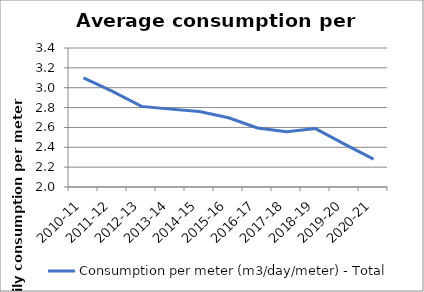
| Category | Consumption per meter (m3/day/meter) - Total |
|---|---|
| 2010-11 | 3.099 |
| 2011-12 | 2.962 |
| 2012-13 | 2.812 |
| 2013-14 | 2.784 |
| 2014-15 | 2.76 |
| 2015-16 | 2.698 |
| 2016-17 | 2.594 |
| 2017-18 | 2.555 |
| 2018-19 | 2.588 |
| 2019-20 | 2.432 |
| 2020-21 | 2.28 |